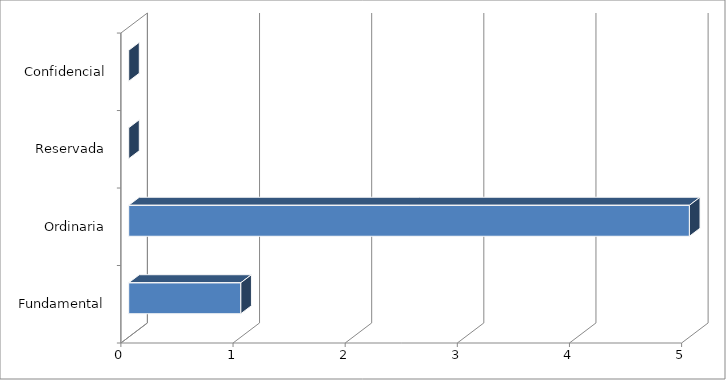
| Category | Series 0 |
|---|---|
| 0 | 1 |
| 1 | 5 |
| 2 | 0 |
| 3 | 0 |